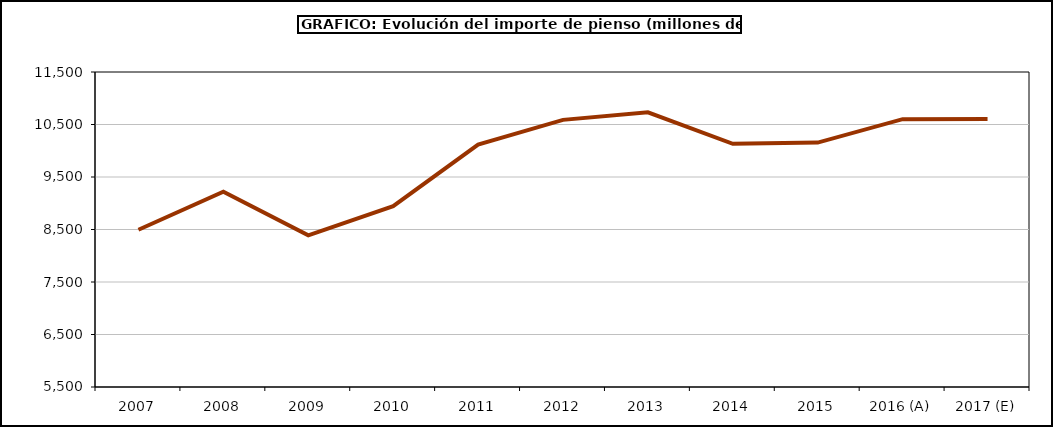
| Category | piensos |
|---|---|
| 2007 | 8496.174 |
| 2008 | 9220.925 |
| 2009 | 8388.144 |
| 2010 | 8943.629 |
| 2011 | 10115.595 |
| 2012 | 10588.115 |
| 2013 | 10733.318 |
| 2014 | 10132.591 |
| 2015 | 10154.98 |
| 2016 (A) | 10601.666 |
| 2017 (E) | 10605.602 |